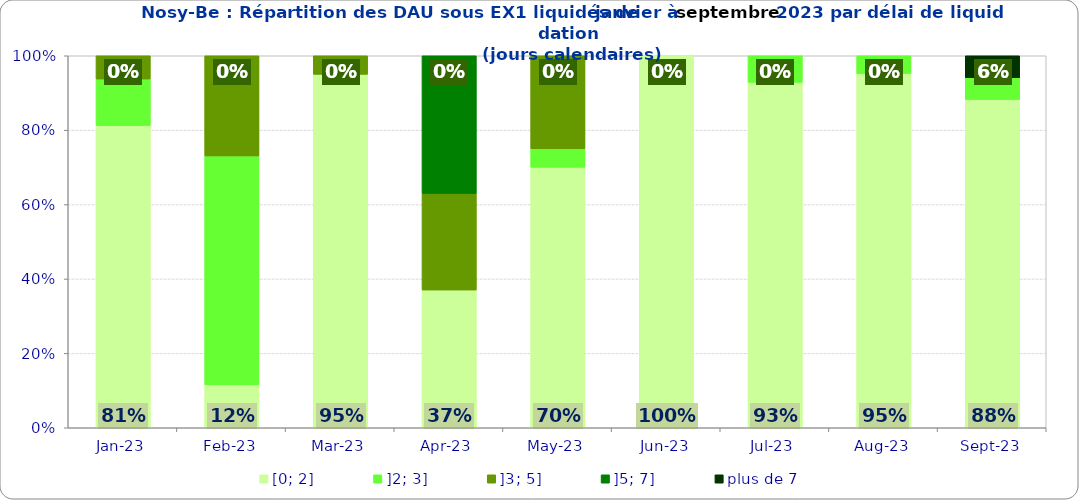
| Category | [0; 2] | ]2; 3] | ]3; 5] | ]5; 7] | plus de 7 |
|---|---|---|---|---|---|
| 2023-01-01 | 0.812 | 0.125 | 0.062 | 0 | 0 |
| 2023-02-01 | 0.115 | 0.615 | 0.269 | 0 | 0 |
| 2023-03-01 | 0.95 | 0 | 0.05 | 0 | 0 |
| 2023-04-01 | 0.37 | 0 | 0.259 | 0.37 | 0 |
| 2023-05-01 | 0.7 | 0.05 | 0.25 | 0 | 0 |
| 2023-06-01 | 1 | 0 | 0 | 0 | 0 |
| 2023-07-01 | 0.929 | 0.071 | 0 | 0 | 0 |
| 2023-08-01 | 0.952 | 0.048 | 0 | 0 | 0 |
| 2023-09-01 | 0.882 | 0.059 | 0 | 0 | 0.059 |